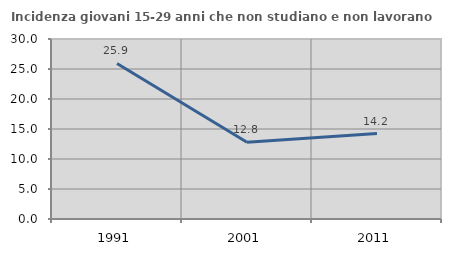
| Category | Incidenza giovani 15-29 anni che non studiano e non lavorano  |
|---|---|
| 1991.0 | 25.926 |
| 2001.0 | 12.788 |
| 2011.0 | 14.244 |